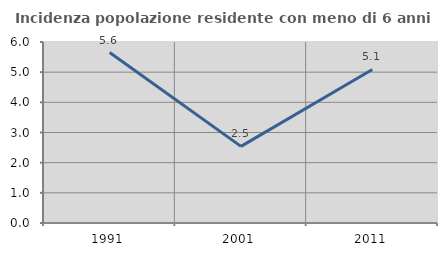
| Category | Incidenza popolazione residente con meno di 6 anni |
|---|---|
| 1991.0 | 5.65 |
| 2001.0 | 2.54 |
| 2011.0 | 5.091 |